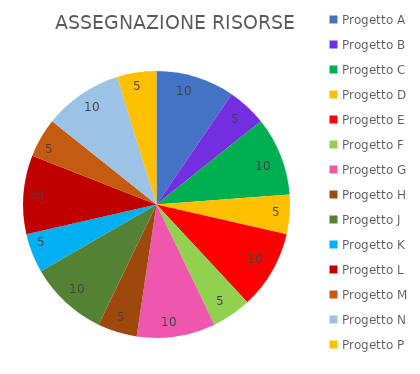
| Category | Series 0 |
|---|---|
| Progetto A | 10 |
| Progetto B | 5 |
| Progetto C | 10 |
| Progetto D | 5 |
| Progetto E | 10 |
| Progetto F | 5 |
| Progetto G | 10 |
| Progetto H | 5 |
| Progetto J | 10 |
| Progetto K | 5 |
| Progetto L | 10 |
| Progetto M | 5 |
| Progetto N | 10 |
| Progetto P | 5 |